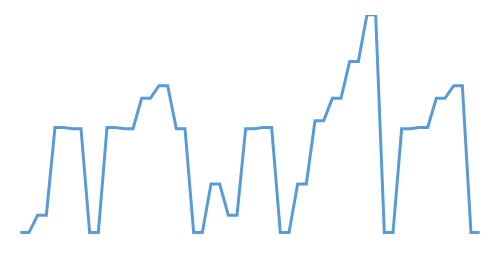
| Category | Series 0 |
|---|---|
| 0.0 | 52.457 |
| 103.3 | 52.457 |
| 125.57 | 53.54 |
| 170.29 | 53.54 |
| 219.33999999999997 | 58.995 |
| 226.21999999999997 | 58.995 |
| 227.23999999999998 | 58.922 |
| 255.01999999999998 | 58.922 |
| 291.04999999999995 | 52.457 |
| 372.04999999999995 | 52.457 |
| 779.05 | 58.995 |
| 782.02 | 58.995 |
| 783.05 | 58.922 |
| 799.3499999999999 | 58.922 |
| 812.43 | 60.811 |
| 827.06 | 60.811 |
| 833.01 | 61.602 |
| 859.21 | 61.602 |
| 877.2800000000001 | 58.922 |
| 886.71 | 58.922 |
| 927.73 | 52.457 |
| 968.73 | 52.457 |
| 973.73 | 55.476 |
| 998.98 | 55.476 |
| 1016.73 | 53.54 |
| 1045.45 | 53.54 |
| 1085.18 | 58.922 |
| 1112.93 | 58.922 |
| 1114.01 | 58.995 |
| 1118.09 | 58.995 |
| 1157.9199999999998 | 52.457 |
| 1181.09 | 52.457 |
| 1206.34 | 55.476 |
| 1214.61 | 55.476 |
| 1239.86 | 59.414 |
| 1240.1299999999999 | 59.414 |
| 1252.28 | 60.811 |
| 1260.55 | 60.811 |
| 1280.8799999999999 | 63.11 |
| 1299.4999999999998 | 63.11 |
| 1323.0999999999997 | 66.022 |
| 1386.4799999999998 | 66.022 |
| 1491.0099999999998 | 52.457 |
| 1527.6899999999998 | 52.457 |
| 1566.86 | 58.922 |
| 1575.74 | 58.922 |
| 1576.79 | 58.995 |
| 1595.32 | 58.995 |
| 1612.6499999999999 | 60.811 |
| 1624.9799999999998 | 60.811 |
| 1635.5999999999997 | 61.602 |
| 1651.4299999999996 | 61.602 |
| 1712.3999999999996 | 52.457 |
| 1743.0499999999997 | 52.457 |